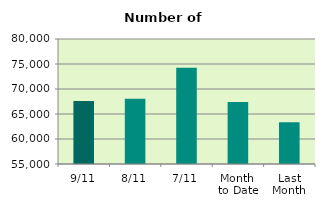
| Category | Series 0 |
|---|---|
| 9/11 | 67580 |
| 8/11 | 68062 |
| 7/11 | 74254 |
| Month 
to Date | 67410.286 |
| Last
Month | 63348.667 |